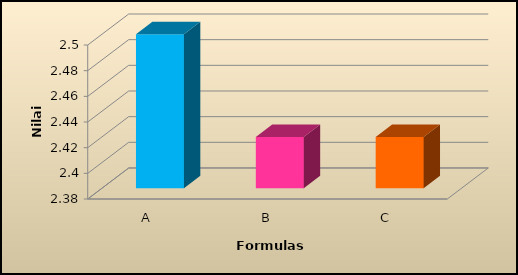
| Category | Rata-rata |
|---|---|
| A | 2.5 |
| B | 2.42 |
| C | 2.42 |